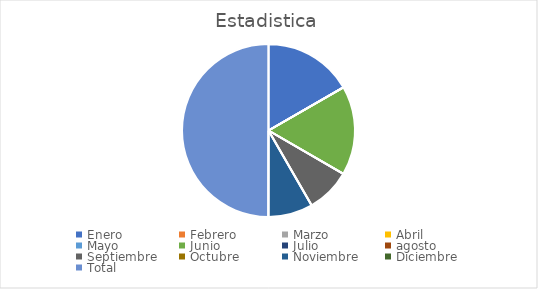
| Category | Estadistica | Nomina | Presupuesto | otros | Total |
|---|---|---|---|---|---|
| Enero | 2 | 0 | 0 | 0 | 2 |
| Febrero | 0 | 0 | 0 | 0 | 0 |
| Marzo | 0 | 0 | 0 | 0 | 0 |
| Abril | 0 | 0 | 0 | 0 | 0 |
| Mayo  | 0 | 0 | 1 | 1 | 2 |
| Junio | 2 | 0 | 0 | 0 | 2 |
| Julio | 0 | 0 | 0 | 0 | 0 |
| agosto | 0 | 0 | 0 | 0 | 0 |
| Septiembre | 1 | 1 | 0 | 0 | 2 |
| Octubre | 0 | 0 | 0 | 1 | 1 |
| Noviembre | 1 | 0 | 0 | 0 | 1 |
| Diciembre | 0 | 0 | 0 | 0 | 0 |
| Total | 6 | 1 | 1 | 2 | 10 |